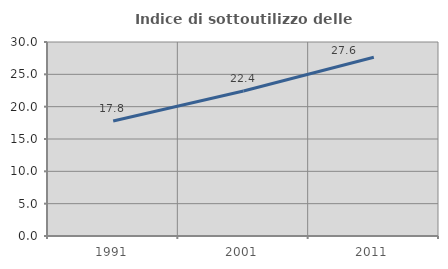
| Category | Indice di sottoutilizzo delle abitazioni  |
|---|---|
| 1991.0 | 17.772 |
| 2001.0 | 22.415 |
| 2011.0 | 27.647 |